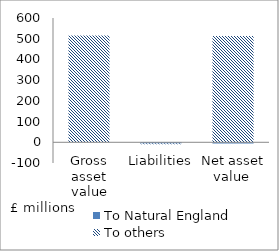
| Category | To Natural England | To others |
|---|---|---|
| Gross asset value | 0 | 515.835 |
| Liabilities | -6.101 | -2.957 |
| Net asset value  | -6.101 | 512.878 |